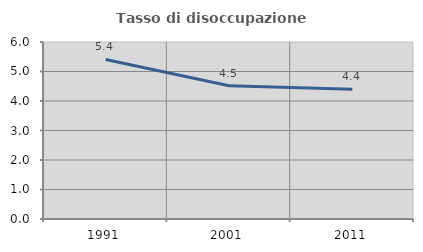
| Category | Tasso di disoccupazione giovanile  |
|---|---|
| 1991.0 | 5.409 |
| 2001.0 | 4.52 |
| 2011.0 | 4.398 |